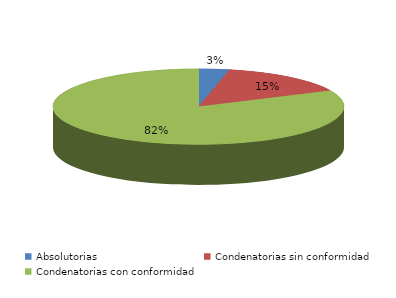
| Category | Series 0 |
|---|---|
| Absolutorias | 7 |
| Condenatorias sin conformidad | 30 |
| Condenatorias con conformidad | 169 |